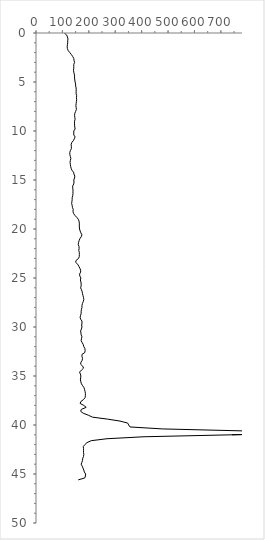
| Category | Series 0 |
|---|---|
| 107.0 | 0 |
| 116.0 | 0.2 |
| 119.0 | 0.4 |
| 121.0 | 0.6 |
| 120.0 | 0.8 |
| 120.0 | 1 |
| 119.0 | 1.2 |
| 118.0 | 1.4 |
| 119.0 | 1.6 |
| 122.0 | 1.8 |
| 128.0 | 2 |
| 134.0 | 2.2 |
| 139.0 | 2.4 |
| 143.0 | 2.6 |
| 144.0 | 2.8 |
| 146.0 | 3 |
| 143.0 | 3.2 |
| 143.0 | 3.4 |
| 143.0 | 3.6 |
| 142.0 | 3.8 |
| 143.0 | 4 |
| 145.0 | 4.2 |
| 146.0 | 4.4 |
| 146.0 | 4.6 |
| 147.0 | 4.8 |
| 148.0 | 5 |
| 150.0 | 5.2 |
| 150.0 | 5.4 |
| 152.0 | 5.6 |
| 152.0 | 5.8 |
| 152.0 | 6 |
| 152.0 | 6.2 |
| 154.0 | 6.4 |
| 153.0 | 6.6 |
| 154.0 | 6.8 |
| 153.0 | 7 |
| 152.0 | 7.2 |
| 151.0 | 7.4 |
| 152.0 | 7.6 |
| 153.0 | 7.8 |
| 150.0 | 8 |
| 147.0 | 8.2 |
| 146.0 | 8.4 |
| 147.0 | 8.6 |
| 148.0 | 8.8 |
| 146.0 | 9 |
| 146.0 | 9.2 |
| 146.0 | 9.4 |
| 147.0 | 9.6 |
| 148.0 | 9.8 |
| 143.0 | 10 |
| 143.0 | 10.2 |
| 143.0 | 10.4 |
| 148.0 | 10.6 |
| 145.0 | 10.8 |
| 141.0 | 11 |
| 135.0 | 11.2 |
| 133.0 | 11.4 |
| 134.0 | 11.6 |
| 134.0 | 11.8 |
| 130.0 | 12 |
| 128.0 | 12.2 |
| 128.0 | 12.4 |
| 130.0 | 12.6 |
| 132.0 | 12.8 |
| 130.0 | 13 |
| 129.0 | 13.2 |
| 130.0 | 13.4 |
| 131.0 | 13.6 |
| 133.0 | 13.8 |
| 136.0 | 14 |
| 142.0 | 14.2 |
| 144.0 | 14.4 |
| 147.0 | 14.6 |
| 146.0 | 14.8 |
| 143.0 | 15 |
| 144.0 | 15.2 |
| 143.0 | 15.4 |
| 139.0 | 15.6 |
| 139.0 | 15.8 |
| 140.0 | 16 |
| 140.0 | 16.2 |
| 140.0 | 16.4 |
| 139.0 | 16.6 |
| 137.0 | 16.8 |
| 137.0 | 17 |
| 136.0 | 17.2 |
| 135.0 | 17.4 |
| 137.0 | 17.6 |
| 138.0 | 17.8 |
| 141.0 | 18 |
| 140.0 | 18.2 |
| 142.0 | 18.4 |
| 147.0 | 18.6 |
| 154.0 | 18.8 |
| 160.0 | 19 |
| 163.0 | 19.2 |
| 164.0 | 19.4 |
| 164.0 | 19.6 |
| 164.0 | 19.8 |
| 165.0 | 20 |
| 167.0 | 20.2 |
| 170.0 | 20.4 |
| 174.0 | 20.6 |
| 171.0 | 20.8 |
| 166.0 | 21 |
| 163.0 | 21.2 |
| 161.0 | 21.4 |
| 160.0 | 21.6 |
| 163.0 | 21.8 |
| 163.0 | 22 |
| 162.0 | 22.2 |
| 164.0 | 22.4 |
| 164.0 | 22.6 |
| 164.0 | 22.8 |
| 161.0 | 23 |
| 152.0 | 23.2 |
| 150.0 | 23.4 |
| 158.0 | 23.6 |
| 162.0 | 23.8 |
| 166.0 | 24 |
| 169.0 | 24.2 |
| 169.0 | 24.4 |
| 165.0 | 24.6 |
| 166.0 | 24.8 |
| 170.0 | 25 |
| 168.0 | 25.2 |
| 170.0 | 25.4 |
| 171.0 | 25.6 |
| 171.0 | 25.8 |
| 169.0 | 26 |
| 172.0 | 26.2 |
| 175.0 | 26.4 |
| 176.0 | 26.6 |
| 178.0 | 26.8 |
| 180.0 | 27 |
| 181.0 | 27.2 |
| 179.0 | 27.4 |
| 176.0 | 27.6 |
| 174.0 | 27.8 |
| 174.0 | 28 |
| 172.0 | 28.2 |
| 171.0 | 28.4 |
| 171.0 | 28.6 |
| 169.0 | 28.8 |
| 167.0 | 29 |
| 169.0 | 29.2 |
| 174.0 | 29.4 |
| 174.0 | 29.6 |
| 173.0 | 29.8 |
| 174.0 | 30 |
| 172.0 | 30.2 |
| 169.0 | 30.4 |
| 170.0 | 30.6 |
| 171.0 | 30.8 |
| 174.0 | 31 |
| 172.0 | 31.2 |
| 171.0 | 31.4 |
| 175.0 | 31.6 |
| 179.0 | 31.8 |
| 181.0 | 32 |
| 185.0 | 32.2 |
| 186.0 | 32.4 |
| 185.0 | 32.6 |
| 174.0 | 32.8 |
| 174.0 | 33 |
| 176.0 | 33.2 |
| 175.0 | 33.4 |
| 170.0 | 33.6 |
| 169.0 | 33.8 |
| 177.0 | 34 |
| 180.0 | 34.2 |
| 172.0 | 34.4 |
| 165.0 | 34.6 |
| 168.0 | 34.8 |
| 170.0 | 35 |
| 169.0 | 35.2 |
| 168.0 | 35.4 |
| 170.0 | 35.6 |
| 172.0 | 35.8 |
| 177.0 | 36 |
| 182.0 | 36.2 |
| 184.0 | 36.4 |
| 186.0 | 36.6 |
| 187.0 | 36.8 |
| 187.0 | 37 |
| 186.0 | 37.2 |
| 180.0 | 37.4 |
| 170.0 | 37.6 |
| 167.0 | 37.8 |
| 181.0 | 38 |
| 190.0 | 38.2 |
| 172.0 | 38.4 |
| 169.0 | 38.6 |
| 179.0 | 38.8 |
| 198.0 | 39 |
| 214.0 | 39.2 |
| 271.0 | 39.4 |
| 318.0 | 39.6 |
| 347.0 | 39.8 |
| 351.0 | 40 |
| 356.0 | 40.2 |
| 478.0 | 40.4 |
| 782.0 | 40.6 |
| 1069.0 | 40.8 |
| 742.0 | 41 |
| 409.0 | 41.2 |
| 269.0 | 41.4 |
| 209.0 | 41.6 |
| 193.0 | 41.8 |
| 185.0 | 42 |
| 179.0 | 42.2 |
| 180.0 | 42.4 |
| 180.0 | 42.6 |
| 180.0 | 42.8 |
| 181.0 | 43 |
| 180.0 | 43.2 |
| 177.0 | 43.4 |
| 176.0 | 43.6 |
| 174.0 | 43.8 |
| 171.0 | 44 |
| 175.0 | 44.2 |
| 178.0 | 44.4 |
| 181.0 | 44.6 |
| 183.0 | 44.8 |
| 188.0 | 45 |
| 187.0 | 45.2 |
| 185.0 | 45.4 |
| 160.0 | 45.6 |